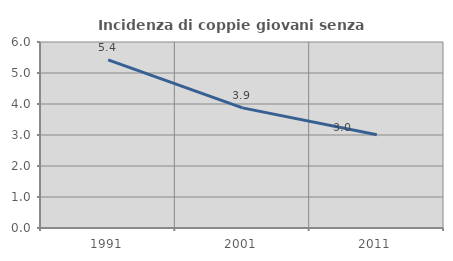
| Category | Incidenza di coppie giovani senza figli |
|---|---|
| 1991.0 | 5.421 |
| 2001.0 | 3.874 |
| 2011.0 | 3.01 |